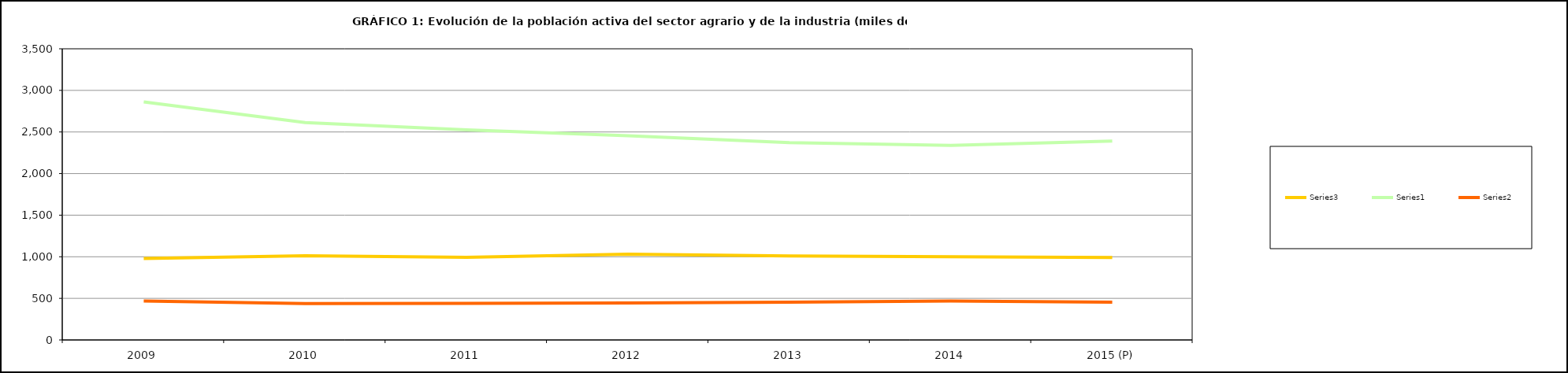
| Category | Series 3 | Series 0 | Series 1 |
|---|---|---|---|
| 2009 | 979.3 | 2862.5 | 467.6 |
| 2010 | 1011.9 | 2612.675 | 438.425 |
| 2011 | 993.225 | 2525.825 | 439.575 |
| 2012 | 1032.125 | 2454.25 | 445.725 |
| 2013 | 1010.5 | 2372.975 | 454.075 |
| 2014 | 1000.9 | 2339.7 | 468.5 |
| 2015 (P) | 990.325 | 2391.725 | 454.1 |